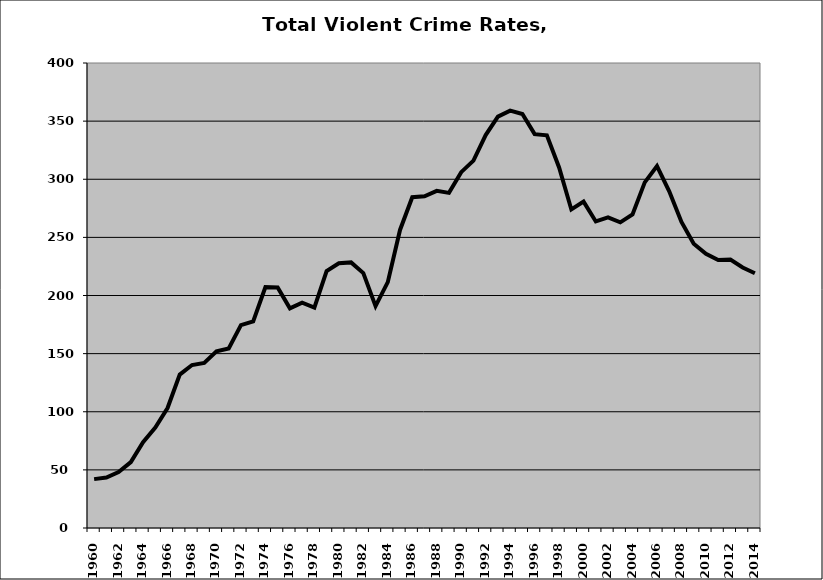
| Category | VCR |
|---|---|
| 1960.0 | 42.034 |
| 1961.0 | 43.372 |
| 1962.0 | 48.173 |
| 1963.0 | 56.657 |
| 1964.0 | 73.871 |
| 1965.0 | 86.494 |
| 1966.0 | 103.216 |
| 1967.0 | 131.965 |
| 1968.0 | 140.181 |
| 1969.0 | 141.973 |
| 1970.0 | 151.955 |
| 1971.0 | 154.419 |
| 1972.0 | 174.487 |
| 1973.0 | 177.726 |
| 1974.0 | 207.276 |
| 1975.0 | 206.954 |
| 1976.0 | 188.953 |
| 1977.0 | 193.836 |
| 1978.0 | 189.646 |
| 1979.0 | 221.01 |
| 1980.0 | 227.763 |
| 1981.0 | 228.46 |
| 1982.0 | 219.26 |
| 1983.0 | 190.854 |
| 1984.0 | 211.485 |
| 1985.0 | 256.404 |
| 1986.0 | 284.551 |
| 1987.0 | 285.398 |
| 1988.0 | 290.06 |
| 1989.0 | 288.284 |
| 1990.0 | 306.096 |
| 1991.0 | 316.02 |
| 1992.0 | 338.036 |
| 1993.0 | 353.907 |
| 1994.0 | 359.032 |
| 1995.0 | 356.095 |
| 1996.0 | 338.815 |
| 1997.0 | 337.751 |
| 1998.0 | 310.18 |
| 1999.0 | 274.002 |
| 2000.0 | 280.782 |
| 2001.0 | 263.716 |
| 2002.0 | 267.235 |
| 2003.0 | 262.945 |
| 2004.0 | 269.81 |
| 2005.0 | 297.324 |
| 2006.0 | 311.316 |
| 2007.0 | 289.671 |
| 2008.0 | 263.279 |
| 2009.0 | 244.464 |
| 2010.0 | 235.957 |
| 2011.0 | 230.453 |
| 2012.0 | 230.852 |
| 2013.0 | 224.066 |
| 2014.0 | 219.088 |